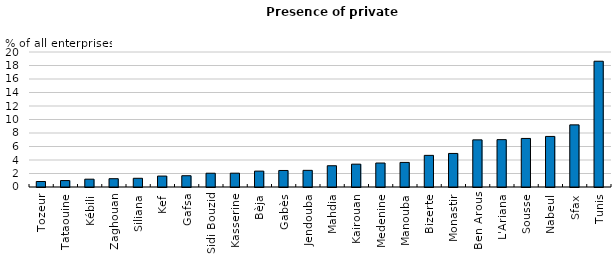
| Category | 2015 |
|---|---|
| Tozeur | 0.817 |
| Tataouine | 0.952 |
| Kébili | 1.158 |
| Zaghouan | 1.23 |
| Siliana | 1.291 |
| Kef | 1.62 |
| Gafsa | 1.671 |
| Sidi Bouzid | 2.04 |
| Kasserine | 2.048 |
| Bèja | 2.353 |
| Gabès | 2.448 |
| Jendouba | 2.468 |
| Mahdia | 3.15 |
| Kairouan | 3.383 |
| Medenine | 3.551 |
| Manouba | 3.643 |
| Bizerte | 4.686 |
| Monastir | 4.97 |
| Ben Arous | 6.984 |
| L'Ariana | 7.015 |
| Sousse | 7.192 |
| Nabeul | 7.492 |
| Sfax | 9.206 |
| Tunis | 18.633 |